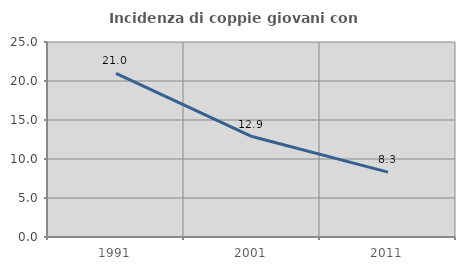
| Category | Incidenza di coppie giovani con figli |
|---|---|
| 1991.0 | 20.982 |
| 2001.0 | 12.879 |
| 2011.0 | 8.32 |